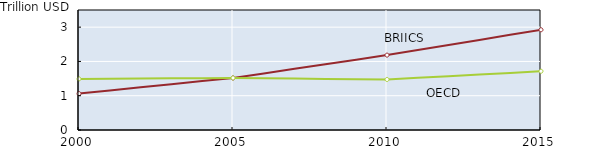
| Category | BRIICS | OECD |
|---|---|---|
| 2000.0 | 1.062 | 1.491 |
| 2001.0 | 1.153 | 1.496 |
| 2002.0 | 1.244 | 1.502 |
| 2003.0 | 1.335 | 1.507 |
| 2004.0 | 1.426 | 1.512 |
| 2005.0 | 1.517 | 1.518 |
| 2006.0 | 1.651 | 1.509 |
| 2007.0 | 1.784 | 1.5 |
| 2008.0 | 1.918 | 1.491 |
| 2009.0 | 2.051 | 1.482 |
| 2010.0 | 2.184 | 1.473 |
| 2011.0 | 2.332 | 1.521 |
| 2012.0 | 2.48 | 1.569 |
| 2013.0 | 2.628 | 1.618 |
| 2014.0 | 2.775 | 1.666 |
| 2015.0 | 2.923 | 1.714 |